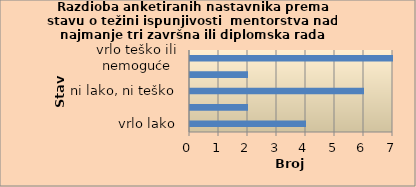
| Category | Series 0 |
|---|---|
| vrlo lako | 4 |
| lako | 2 |
| ni lako, ni teško | 6 |
| teško | 2 |
| vrlo teško ili nemoguće | 7 |